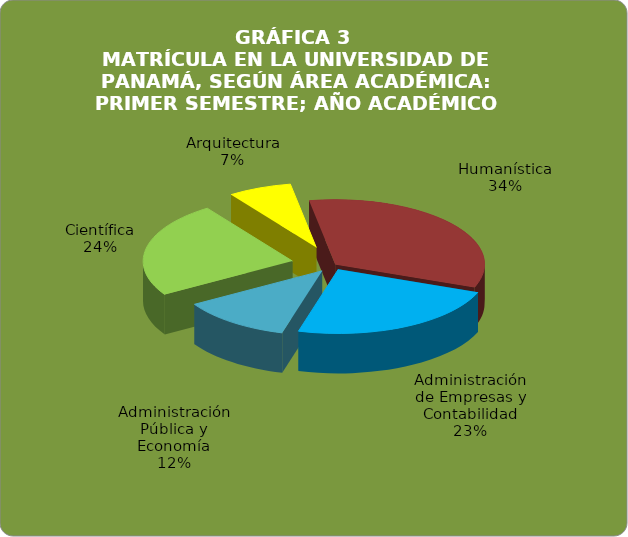
| Category | Series 0 |
|---|---|
| Humanística | 33.59 |
| Administración de Empresas y Contabilidad | 23.486 |
| Administración Pública y Economía | 11.996 |
| Científica | 24.056 |
| Arquitectura | 6.872 |